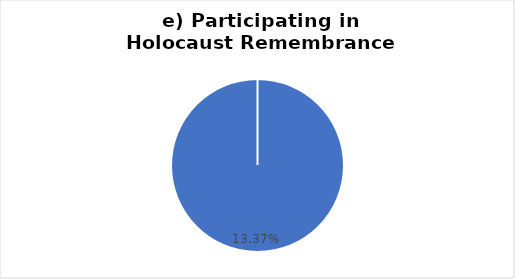
| Category | e) honouring the Holocaust Remembrance Day |
|---|---|
| 0 | 0.134 |